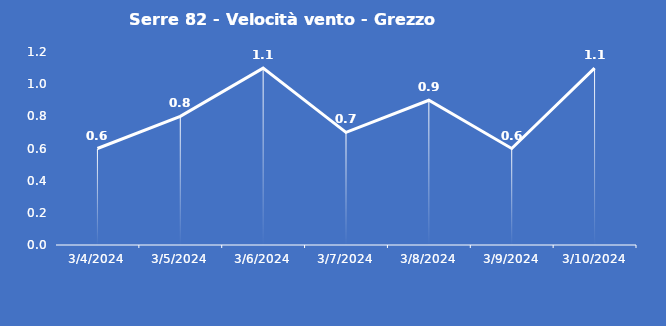
| Category | Serre 82 - Velocità vento - Grezzo (m/s) |
|---|---|
| 3/4/24 | 0.6 |
| 3/5/24 | 0.8 |
| 3/6/24 | 1.1 |
| 3/7/24 | 0.7 |
| 3/8/24 | 0.9 |
| 3/9/24 | 0.6 |
| 3/10/24 | 1.1 |